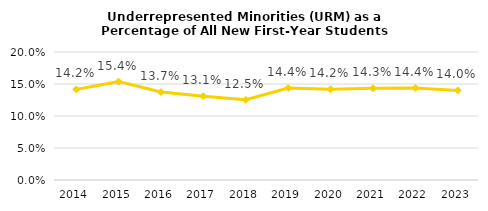
| Category | Series 0 |
|---|---|
| 2014.0 | 0.142 |
| 2015.0 | 0.154 |
| 2016.0 | 0.137 |
| 2017.0 | 0.131 |
| 2018.0 | 0.125 |
| 2019.0 | 0.144 |
| 2020.0 | 0.142 |
| 2021.0 | 0.143 |
| 2022.0 | 0.144 |
| 2023.0 | 0.14 |